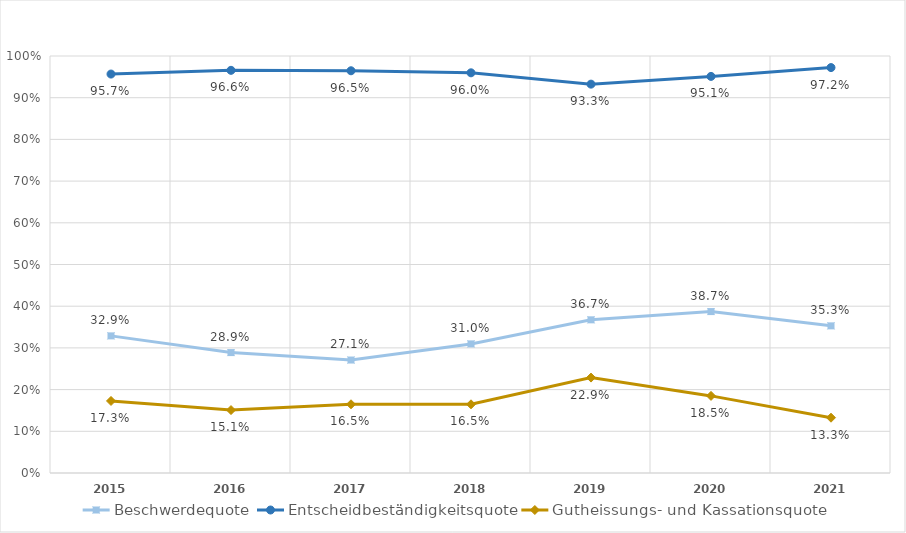
| Category | Beschwerdequote | Entscheidbeständigkeitsquote | Gutheissungs- und Kassationsquote |
|---|---|---|---|
| 2015.0 | 0.329 | 0.957 | 0.173 |
| 2016.0 | 0.289 | 0.966 | 0.151 |
| 2017.0 | 0.271 | 0.965 | 0.165 |
| 2018.0 | 0.31 | 0.96 | 0.165 |
| 2019.0 | 0.367 | 0.933 | 0.229 |
| 2020.0 | 0.387 | 0.951 | 0.185 |
| 2021.0 | 0.353 | 0.972 | 0.133 |